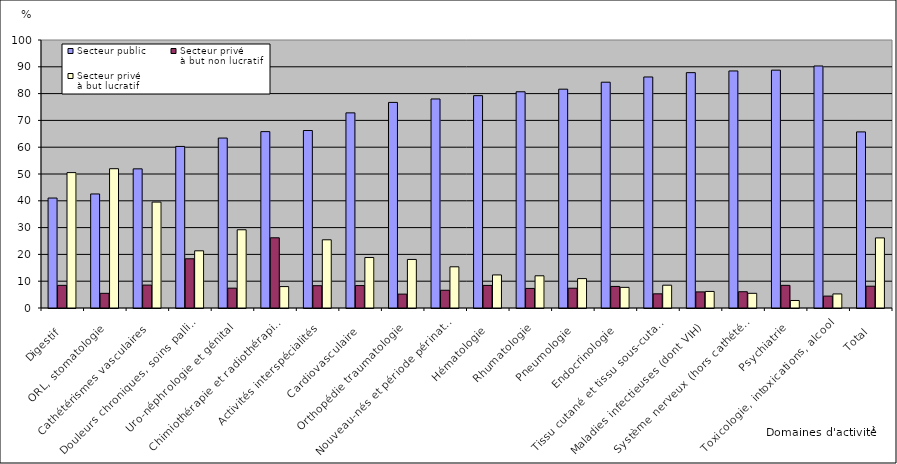
| Category | Secteur public | Secteur privé 
à but non lucratif | Secteur privé 
à but lucratif |
|---|---|---|---|
| Digestif | 41.03 | 8.45 | 50.52 |
| ORL, stomatologie | 42.55 | 5.47 | 51.98 |
| Cathétérismes vasculaires  | 51.92 | 8.55 | 39.52 |
| Douleurs chroniques, soins palliatifs | 60.29 | 18.37 | 21.34 |
| Uro-néphrologie et génital | 63.41 | 7.4 | 29.19 |
| Chimiothérapie et radiothérapie (hors séances) | 65.81 | 26.2 | 7.99 |
| Activités interspécialités | 66.23 | 8.32 | 25.45 |
| Cardiovasculaire  | 72.81 | 8.37 | 18.83 |
| Orthopédie traumatologie | 76.71 | 5.18 | 18.12 |
| Nouveau-nés et période périnatale | 78 | 6.62 | 15.37 |
| Hématologie | 79.23 | 8.43 | 12.34 |
| Rhumatologie | 80.68 | 7.3 | 12.02 |
| Pneumologie | 81.65 | 7.38 | 10.97 |
| Endocrinologie | 84.25 | 8.05 | 7.7 |
| Tissu cutané et tissu sous-cutané | 86.2 | 5.29 | 8.51 |
| Maladies infectieuses (dont VIH) | 87.82 | 6.01 | 6.18 |
| Système nerveux (hors cathétérismes vasculaires diagnostiques et interventionnels) | 88.45 | 6.07 | 5.48 |
| Psychiatrie | 88.75 | 8.45 | 2.8 |
| Toxicologie, intoxications, alcool | 90.31 | 4.44 | 5.25 |
| Total | 65.71 | 8.13 | 26.16 |